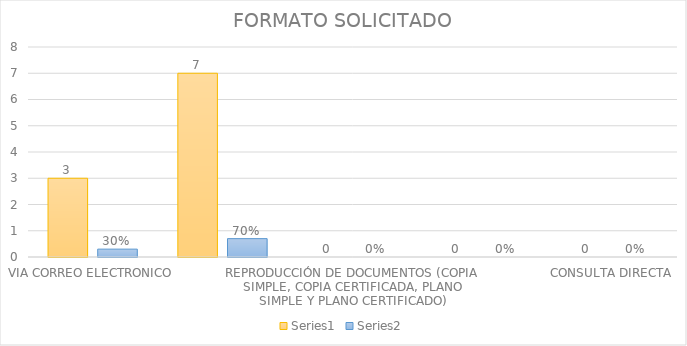
| Category | Series 3 | Series 4 |
|---|---|---|
| VIA CORREO ELECTRONICO | 3 | 0.3 |
| VÍA PNT | 7 | 0.7 |
| REPRODUCCIÓN DE DOCUMENTOS (COPIA SIMPLE, COPIA CERTIFICADA, PLANO SIMPLE Y PLANO CERTIFICADO) | 0 | 0 |
| FORMATO DIGITAL | 0 | 0 |
| CONSULTA DIRECTA | 0 | 0 |